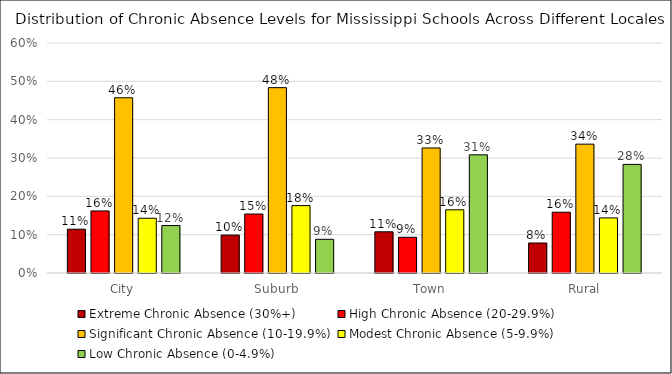
| Category | Extreme Chronic Absence (30%+) | High Chronic Absence (20-29.9%) | Significant Chronic Absence (10-19.9%) | Modest Chronic Absence (5-9.9%) | Low Chronic Absence (0-4.9%) |
|---|---|---|---|---|---|
| City | 0.114 | 0.162 | 0.457 | 0.143 | 0.124 |
| Suburb | 0.099 | 0.154 | 0.484 | 0.176 | 0.088 |
| Town | 0.108 | 0.093 | 0.326 | 0.165 | 0.308 |
| Rural | 0.078 | 0.159 | 0.336 | 0.144 | 0.283 |